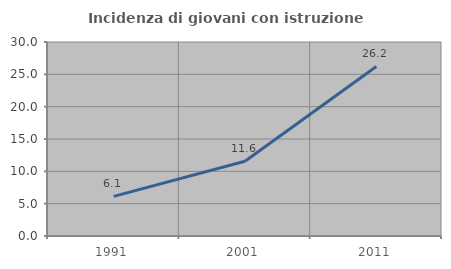
| Category | Incidenza di giovani con istruzione universitaria |
|---|---|
| 1991.0 | 6.121 |
| 2001.0 | 11.554 |
| 2011.0 | 26.212 |